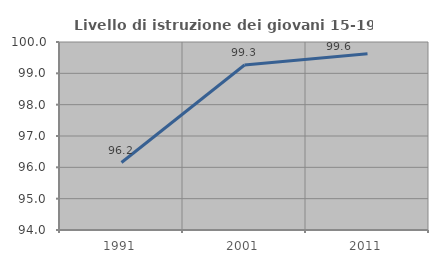
| Category | Livello di istruzione dei giovani 15-19 anni |
|---|---|
| 1991.0 | 96.154 |
| 2001.0 | 99.267 |
| 2011.0 | 99.625 |